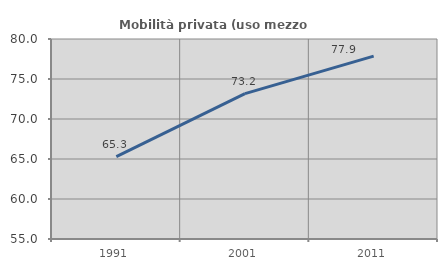
| Category | Mobilità privata (uso mezzo privato) |
|---|---|
| 1991.0 | 65.306 |
| 2001.0 | 73.171 |
| 2011.0 | 77.866 |